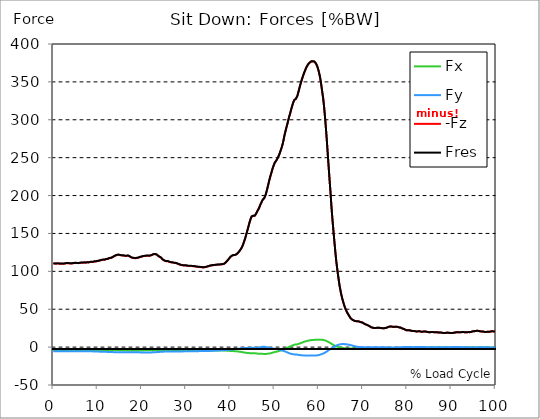
| Category |  Fx |  Fy |  -Fz |  Fres |
|---|---|---|---|---|
| 0.0 | -4.409 | -5.582 | 110.319 | 110.553 |
| 0.167348456675344 | -4.423 | -5.576 | 110.296 | 110.528 |
| 0.334696913350688 | -4.415 | -5.574 | 110.225 | 110.457 |
| 0.5020453700260321 | -4.398 | -5.568 | 110.176 | 110.407 |
| 0.669393826701376 | -4.362 | -5.558 | 110.17 | 110.399 |
| 0.83674228337672 | -4.415 | -5.533 | 110.345 | 110.575 |
| 1.0040907400520642 | -4.486 | -5.548 | 110.381 | 110.614 |
| 1.1621420602454444 | -4.445 | -5.577 | 110.21 | 110.445 |
| 1.3294905169207885 | -4.463 | -5.581 | 110.155 | 110.389 |
| 1.4968389735961325 | -4.468 | -5.563 | 110.136 | 110.371 |
| 1.6641874302714765 | -4.473 | -5.565 | 110.144 | 110.377 |
| 1.8315358869468206 | -4.472 | -5.595 | 110.119 | 110.355 |
| 1.9988843436221646 | -4.441 | -5.624 | 109.989 | 110.225 |
| 2.1662328002975086 | -4.432 | -5.603 | 109.993 | 110.227 |
| 2.333581256972853 | -4.429 | -5.576 | 110.012 | 110.244 |
| 2.5009297136481967 | -4.432 | -5.547 | 110.209 | 110.44 |
| 2.6682781703235405 | -4.436 | -5.517 | 110.408 | 110.638 |
| 2.8356266269988843 | -4.464 | -5.51 | 110.581 | 110.811 |
| 3.002975083674229 | -4.505 | -5.512 | 110.742 | 110.973 |
| 3.1703235403495724 | -4.496 | -5.51 | 110.774 | 111.005 |
| 3.337671997024917 | -4.466 | -5.509 | 110.682 | 110.912 |
| 3.4957233172182973 | -4.457 | -5.488 | 110.6 | 110.828 |
| 3.663071773893641 | -4.443 | -5.483 | 110.521 | 110.748 |
| 3.8304202305689854 | -4.419 | -5.471 | 110.455 | 110.681 |
| 3.997768687244329 | -4.394 | -5.447 | 110.412 | 110.635 |
| 4.165117143919673 | -4.387 | -5.435 | 110.426 | 110.65 |
| 4.332465600595017 | -4.399 | -5.437 | 110.521 | 110.744 |
| 4.499814057270361 | -4.42 | -5.443 | 110.646 | 110.871 |
| 4.667162513945706 | -4.458 | -5.456 | 110.851 | 111.077 |
| 4.834510970621049 | -4.496 | -5.468 | 111.057 | 111.285 |
| 5.001859427296393 | -4.506 | -5.488 | 111.13 | 111.36 |
| 5.169207883971737 | -4.491 | -5.516 | 111.037 | 111.267 |
| 5.336556340647081 | -4.434 | -5.528 | 110.856 | 111.085 |
| 5.503904797322425 | -4.377 | -5.528 | 110.746 | 110.973 |
| 5.671253253997769 | -4.375 | -5.534 | 110.823 | 111.05 |
| 5.82930457419115 | -4.366 | -5.529 | 110.921 | 111.147 |
| 5.996653030866494 | -4.362 | -5.52 | 111.045 | 111.27 |
| 6.164001487541838 | -4.389 | -5.486 | 111.296 | 111.521 |
| 6.331349944217181 | -4.445 | -5.484 | 111.518 | 111.744 |
| 6.498698400892526 | -4.462 | -5.534 | 111.516 | 111.744 |
| 6.66604685756787 | -4.43 | -5.564 | 111.404 | 111.633 |
| 6.833395314243213 | -4.457 | -5.553 | 111.517 | 111.747 |
| 7.000743770918558 | -4.5 | -5.57 | 111.624 | 111.856 |
| 7.168092227593902 | -4.447 | -5.618 | 111.518 | 111.751 |
| 7.335440684269246 | -4.377 | -5.635 | 111.446 | 111.677 |
| 7.50278914094459 | -4.383 | -5.603 | 111.668 | 111.897 |
| 7.6701375976199335 | -4.45 | -5.588 | 111.875 | 112.106 |
| 7.837486054295278 | -4.424 | -5.606 | 111.844 | 112.074 |
| 7.995537374488658 | -4.33 | -5.611 | 111.759 | 111.986 |
| 8.162885831164003 | -4.289 | -5.592 | 111.908 | 112.131 |
| 8.330234287839346 | -4.329 | -5.584 | 112.29 | 112.515 |
| 8.49758274451469 | -4.372 | -5.586 | 112.423 | 112.649 |
| 8.664931201190035 | -4.307 | -5.613 | 112.353 | 112.577 |
| 8.832279657865378 | -4.211 | -5.641 | 112.323 | 112.545 |
| 8.999628114540721 | -4.199 | -5.647 | 112.504 | 112.726 |
| 9.166976571216066 | -4.297 | -5.651 | 112.828 | 113.054 |
| 9.334325027891412 | -4.333 | -5.695 | 112.98 | 113.21 |
| 9.501673484566755 | -4.27 | -5.753 | 113.01 | 113.241 |
| 9.669021941242098 | -4.221 | -5.783 | 113.098 | 113.328 |
| 9.836370397917442 | -4.247 | -5.791 | 113.348 | 113.579 |
| 10.003718854592787 | -4.311 | -5.812 | 113.652 | 113.887 |
| 10.17106731126813 | -4.367 | -5.867 | 113.86 | 114.098 |
| 10.329118631461512 | -4.376 | -5.94 | 113.962 | 114.205 |
| 10.496467088136853 | -4.317 | -6.006 | 114.101 | 114.346 |
| 10.663815544812199 | -4.302 | -6.034 | 114.501 | 114.747 |
| 10.831164001487544 | -4.322 | -6.053 | 114.921 | 115.168 |
| 10.998512458162887 | -4.318 | -6.118 | 115.087 | 115.338 |
| 11.16586091483823 | -4.264 | -6.15 | 115.119 | 115.371 |
| 11.333209371513574 | -4.252 | -6.184 | 115.274 | 115.526 |
| 11.50055782818892 | -4.258 | -6.204 | 115.242 | 115.496 |
| 11.667906284864264 | -4.224 | -6.168 | 115.464 | 115.715 |
| 11.835254741539607 | -4.273 | -6.161 | 115.822 | 116.072 |
| 12.00260319821495 | -4.314 | -6.236 | 116.115 | 116.372 |
| 12.169951654890292 | -4.251 | -6.319 | 116.124 | 116.383 |
| 12.337300111565641 | -4.193 | -6.36 | 116.35 | 116.609 |
| 12.504648568240984 | -4.226 | -6.391 | 116.929 | 117.19 |
| 12.662699888434362 | -4.257 | -6.45 | 117.408 | 117.673 |
| 12.830048345109708 | -4.265 | -6.5 | 117.607 | 117.876 |
| 12.997396801785053 | -4.195 | -6.506 | 117.645 | 117.912 |
| 13.164745258460396 | -4.188 | -6.516 | 118.06 | 118.327 |
| 13.33209371513574 | -4.186 | -6.566 | 118.364 | 118.633 |
| 13.499442171811083 | -4.167 | -6.617 | 118.912 | 119.183 |
| 13.666790628486426 | -4.129 | -6.654 | 119.677 | 119.947 |
| 13.834139085161771 | -4.16 | -6.673 | 120.355 | 120.627 |
| 14.001487541837117 | -4.162 | -6.731 | 120.695 | 120.969 |
| 14.16883599851246 | -4.138 | -6.785 | 121.047 | 121.322 |
| 14.336184455187803 | -4.143 | -6.826 | 121.394 | 121.672 |
| 14.503532911863147 | -4.213 | -6.816 | 121.762 | 122.042 |
| 14.670881368538492 | -4.246 | -6.79 | 121.875 | 122.155 |
| 14.828932688731873 | -4.224 | -6.775 | 121.77 | 122.049 |
| 14.996281145407215 | -4.24 | -6.762 | 121.461 | 121.74 |
| 15.163629602082558 | -4.23 | -6.763 | 121.348 | 121.627 |
| 15.330978058757903 | -4.243 | -6.785 | 121.068 | 121.348 |
| 15.498326515433247 | -4.201 | -6.769 | 120.77 | 121.05 |
| 15.665674972108594 | -4.257 | -6.701 | 120.851 | 121.13 |
| 15.833023428783937 | -4.314 | -6.695 | 120.898 | 121.178 |
| 16.00037188545928 | -4.333 | -6.725 | 120.697 | 120.979 |
| 16.167720342134626 | -4.329 | -6.741 | 120.42 | 120.704 |
| 16.335068798809967 | -4.286 | -6.724 | 120.231 | 120.514 |
| 16.502417255485312 | -4.319 | -6.674 | 120.377 | 120.657 |
| 16.669765712160658 | -4.397 | -6.67 | 120.538 | 120.819 |
| 16.837114168836 | -4.443 | -6.676 | 120.514 | 120.799 |
| 17.004462625511344 | -4.501 | -6.67 | 120.466 | 120.753 |
| 17.16251394570472 | -4.528 | -6.731 | 120 | 120.291 |
| 17.32986240238007 | -4.494 | -6.796 | 119.334 | 119.628 |
| 17.497210859055414 | -4.459 | -6.86 | 118.665 | 118.962 |
| 17.664559315730756 | -4.441 | -6.9 | 118.193 | 118.49 |
| 17.8319077724061 | -4.541 | -6.899 | 117.795 | 118.097 |
| 17.999256229081443 | -4.596 | -6.905 | 117.504 | 117.81 |
| 18.166604685756788 | -4.6 | -6.915 | 117.55 | 117.857 |
| 18.333953142432133 | -4.613 | -6.912 | 117.439 | 117.747 |
| 18.501301599107478 | -4.591 | -6.88 | 117.369 | 117.673 |
| 18.668650055782823 | -4.585 | -6.861 | 117.366 | 117.671 |
| 18.835998512458165 | -4.579 | -6.851 | 117.486 | 117.789 |
| 19.00334696913351 | -4.536 | -6.857 | 117.703 | 118.004 |
| 19.170695425808855 | -4.478 | -6.899 | 117.914 | 118.215 |
| 19.338043882484197 | -4.429 | -6.936 | 118.155 | 118.455 |
| 19.496095202677576 | -4.441 | -6.941 | 118.633 | 118.932 |
| 19.66344365935292 | -4.472 | -6.959 | 118.991 | 119.292 |
| 19.830792116028263 | -4.413 | -7.007 | 119.17 | 119.471 |
| 19.998140572703612 | -4.339 | -6.989 | 119.371 | 119.666 |
| 20.165489029378953 | -4.334 | -6.958 | 119.743 | 120.036 |
| 20.3328374860543 | -4.328 | -6.948 | 120.06 | 120.353 |
| 20.500185942729644 | -4.286 | -6.955 | 120.269 | 120.56 |
| 20.667534399404985 | -4.241 | -7.002 | 120.152 | 120.445 |
| 20.83488285608033 | -4.198 | -7.025 | 120.19 | 120.48 |
| 21.002231312755672 | -4.214 | -7.009 | 120.5 | 120.79 |
| 21.16957976943102 | -4.244 | -7.014 | 120.631 | 120.923 |
| 21.336928226106362 | -4.23 | -7.063 | 120.491 | 120.785 |
| 21.504276682781704 | -4.186 | -7.085 | 120.29 | 120.584 |
| 21.67162513945705 | -4.177 | -7.049 | 120.407 | 120.698 |
| 21.82967645965043 | -4.235 | -7.007 | 120.705 | 120.995 |
| 21.997024916325774 | -4.249 | -7.017 | 120.873 | 121.162 |
| 22.16437337300112 | -4.313 | -6.994 | 121.14 | 121.43 |
| 22.33172182967646 | -4.349 | -6.956 | 121.634 | 121.923 |
| 22.499070286351806 | -4.349 | -6.92 | 122.199 | 122.485 |
| 22.666418743027148 | -4.306 | -6.859 | 122.545 | 122.827 |
| 22.833767199702496 | -4.284 | -6.846 | 122.634 | 122.914 |
| 23.00111565637784 | -4.305 | -6.74 | 122.673 | 122.95 |
| 23.168464113053183 | -4.307 | -6.652 | 122.576 | 122.85 |
| 23.335812569728528 | -4.287 | -6.597 | 122.123 | 122.396 |
| 23.50316102640387 | -4.271 | -6.531 | 121.52 | 121.791 |
| 23.670509483079215 | -4.238 | -6.432 | 120.453 | 120.72 |
| 23.83785793975456 | -4.181 | -6.383 | 119.694 | 119.957 |
| 23.995909259947936 | -4.231 | -6.305 | 119.096 | 119.359 |
| 24.163257716623285 | -4.313 | -6.27 | 118.725 | 118.99 |
| 24.330606173298627 | -4.323 | -6.224 | 118.07 | 118.337 |
| 24.49795462997397 | -4.294 | -6.144 | 116.918 | 117.182 |
| 24.665303086649313 | -4.274 | -6.058 | 115.775 | 116.037 |
| 24.83265154332466 | -4.29 | -5.988 | 115.074 | 115.333 |
| 25.0 | -4.342 | -5.955 | 114.58 | 114.839 |
| 25.167348456675345 | -4.371 | -5.941 | 113.937 | 114.198 |
| 25.334696913350694 | -4.378 | -5.952 | 113.501 | 113.763 |
| 25.502045370026035 | -4.414 | -5.925 | 113.385 | 113.646 |
| 25.669393826701377 | -4.429 | -5.934 | 113.394 | 113.657 |
| 25.836742283376722 | -4.459 | -5.931 | 113.319 | 113.585 |
| 26.004090740052067 | -4.458 | -5.926 | 113.068 | 113.332 |
| 26.17143919672741 | -4.443 | -5.936 | 112.609 | 112.873 |
| 26.329490516920792 | -4.432 | -5.932 | 112.194 | 112.459 |
| 26.49683897359613 | -4.425 | -5.883 | 111.991 | 112.254 |
| 26.66418743027148 | -4.437 | -5.851 | 111.86 | 112.122 |
| 26.831535886946828 | -4.453 | -5.83 | 111.738 | 111.999 |
| 26.998884343622166 | -4.475 | -5.786 | 111.576 | 111.837 |
| 27.166232800297514 | -4.486 | -5.771 | 111.33 | 111.591 |
| 27.333581256972852 | -4.478 | -5.783 | 111.14 | 111.402 |
| 27.5009297136482 | -4.502 | -5.8 | 111.042 | 111.306 |
| 27.668278170323543 | -4.522 | -5.81 | 110.909 | 111.173 |
| 27.835626626998888 | -4.516 | -5.802 | 110.657 | 110.921 |
| 28.002975083674233 | -4.511 | -5.789 | 110.33 | 110.593 |
| 28.170323540349575 | -4.507 | -5.768 | 109.925 | 110.188 |
| 28.33767199702492 | -4.467 | -5.749 | 109.389 | 109.65 |
| 28.50502045370026 | -4.462 | -5.705 | 109.012 | 109.27 |
| 28.663071773893645 | -4.496 | -5.665 | 108.749 | 109.007 |
| 28.830420230568986 | -4.506 | -5.662 | 108.455 | 108.713 |
| 28.99776868724433 | -4.499 | -5.657 | 108.194 | 108.452 |
| 29.165117143919673 | -4.478 | -5.649 | 107.959 | 108.217 |
| 29.33246560059502 | -4.475 | -5.64 | 107.864 | 108.12 |
| 29.499814057270367 | -4.482 | -5.625 | 107.823 | 108.08 |
| 29.66716251394571 | -4.494 | -5.598 | 107.795 | 108.05 |
| 29.834510970621054 | -4.51 | -5.588 | 107.743 | 108 |
| 30.00185942729639 | -4.525 | -5.582 | 107.687 | 107.943 |
| 30.169207883971744 | -4.529 | -5.59 | 107.474 | 107.733 |
| 30.33655634064708 | -4.532 | -5.592 | 107.283 | 107.542 |
| 30.50390479732243 | -4.534 | -5.585 | 107.166 | 107.425 |
| 30.671253253997772 | -4.544 | -5.574 | 107.112 | 107.37 |
| 30.829304574191156 | -4.566 | -5.554 | 107.143 | 107.4 |
| 30.996653030866494 | -4.587 | -5.536 | 107.174 | 107.431 |
| 31.164001487541842 | -4.614 | -5.515 | 107.041 | 107.297 |
| 31.331349944217187 | -4.639 | -5.495 | 106.903 | 107.161 |
| 31.498698400892525 | -4.643 | -5.498 | 106.846 | 107.104 |
| 31.666046857567874 | -4.646 | -5.5 | 106.79 | 107.048 |
| 31.833395314243212 | -4.646 | -5.499 | 106.705 | 106.963 |
| 32.00074377091856 | -4.636 | -5.48 | 106.521 | 106.778 |
| 32.1680922275939 | -4.627 | -5.462 | 106.337 | 106.592 |
| 32.33544068426925 | -4.619 | -5.432 | 106.14 | 106.394 |
| 32.50278914094459 | -4.619 | -5.387 | 105.928 | 106.178 |
| 32.670137597619934 | -4.654 | -5.35 | 105.894 | 106.145 |
| 32.83748605429528 | -4.688 | -5.314 | 105.861 | 106.113 |
| 33.004834510970625 | -4.719 | -5.283 | 105.81 | 106.061 |
| 33.162885831164004 | -4.733 | -5.28 | 105.657 | 105.91 |
| 33.33023428783935 | -4.747 | -5.276 | 105.506 | 105.758 |
| 33.497582744514695 | -4.76 | -5.274 | 105.354 | 105.607 |
| 33.664931201190036 | -4.753 | -5.267 | 105.276 | 105.528 |
| 33.83227965786538 | -4.732 | -5.258 | 105.238 | 105.489 |
| 33.99962811454073 | -4.713 | -5.249 | 105.2 | 105.45 |
| 34.16697657121607 | -4.693 | -5.232 | 105.267 | 105.512 |
| 34.33432502789141 | -4.673 | -5.204 | 105.52 | 105.763 |
| 34.50167348456676 | -4.652 | -5.174 | 105.773 | 106.012 |
| 34.6690219412421 | -4.67 | -5.128 | 106.018 | 106.256 |
| 34.83637039791744 | -4.704 | -5.072 | 106.26 | 106.495 |
| 35.00371885459279 | -4.725 | -5.026 | 106.558 | 106.79 |
| 35.17106731126814 | -4.727 | -4.989 | 106.935 | 107.163 |
| 35.338415767943474 | -4.724 | -4.948 | 107.246 | 107.471 |
| 35.49646708813686 | -4.713 | -4.907 | 107.507 | 107.729 |
| 35.6638155448122 | -4.682 | -4.867 | 107.735 | 107.952 |
| 35.831164001487544 | -4.625 | -4.818 | 107.849 | 108.061 |
| 35.998512458162885 | -4.569 | -4.769 | 107.966 | 108.172 |
| 36.165860914838234 | -4.515 | -4.726 | 108.124 | 108.327 |
| 36.333209371513576 | -4.479 | -4.687 | 108.247 | 108.446 |
| 36.50055782818892 | -4.458 | -4.65 | 108.349 | 108.545 |
| 36.667906284864266 | -4.435 | -4.611 | 108.516 | 108.709 |
| 36.83525474153961 | -4.4 | -4.576 | 108.591 | 108.781 |
| 37.002603198214956 | -4.4 | -4.515 | 108.711 | 108.898 |
| 37.1699516548903 | -4.403 | -4.451 | 108.835 | 109.018 |
| 37.337300111565646 | -4.404 | -4.398 | 108.9 | 109.081 |
| 37.50464856824098 | -4.407 | -4.348 | 108.952 | 109.13 |
| 37.66269988843437 | -4.381 | -4.291 | 109.005 | 109.179 |
| 37.83004834510971 | -4.35 | -4.232 | 109.043 | 109.215 |
| 37.99739680178505 | -4.342 | -4.167 | 109.176 | 109.344 |
| 38.16474525846039 | -4.349 | -4.103 | 109.392 | 109.558 |
| 38.33209371513574 | -4.346 | -4.095 | 109.505 | 109.67 |
| 38.49944217181109 | -4.345 | -4.093 | 109.628 | 109.792 |
| 38.666790628486424 | -4.398 | -4.064 | 110.124 | 110.29 |
| 38.83413908516178 | -4.469 | -4.027 | 110.822 | 110.988 |
| 39.001487541837115 | -4.571 | -3.947 | 111.806 | 111.973 |
| 39.16883599851246 | -4.678 | -3.835 | 112.814 | 112.982 |
| 39.336184455187805 | -4.748 | -3.762 | 113.966 | 114.133 |
| 39.503532911863154 | -4.819 | -3.673 | 115.104 | 115.269 |
| 39.670881368538495 | -4.9 | -3.561 | 116.268 | 116.432 |
| 39.83822982521384 | -4.969 | -3.518 | 117.51 | 117.674 |
| 39.996281145407224 | -5.014 | -3.415 | 118.807 | 118.969 |
| 40.163629602082565 | -5.085 | -3.294 | 119.778 | 119.939 |
| 40.33097805875791 | -5.157 | -3.182 | 120.443 | 120.602 |
| 40.498326515433256 | -5.2 | -3.075 | 120.969 | 121.127 |
| 40.6656749721086 | -5.229 | -2.966 | 121.317 | 121.473 |
| 40.83302342878393 | -5.254 | -2.859 | 121.256 | 121.409 |
| 41.00037188545929 | -5.344 | -2.752 | 121.41 | 121.565 |
| 41.16772034213463 | -5.441 | -2.614 | 121.838 | 121.995 |
| 41.33506879880997 | -5.474 | -2.56 | 122.219 | 122.377 |
| 41.50241725548531 | -5.57 | -2.452 | 122.942 | 123.103 |
| 41.66976571216066 | -5.692 | -2.339 | 123.813 | 123.978 |
| 41.837114168836 | -5.86 | -2.194 | 124.898 | 125.068 |
| 42.004462625511344 | -6.01 | -2.07 | 126.027 | 126.201 |
| 42.17181108218669 | -6.131 | -1.956 | 127.242 | 127.418 |
| 42.32986240238007 | -6.247 | -1.795 | 128.803 | 128.98 |
| 42.497210859055414 | -6.361 | -1.617 | 130.308 | 130.485 |
| 42.66455931573076 | -6.509 | -1.474 | 132.119 | 132.299 |
| 42.831907772406105 | -6.722 | -1.357 | 134.357 | 134.544 |
| 42.999256229081446 | -6.953 | -1.271 | 137.043 | 137.237 |
| 43.16660468575679 | -7.15 | -1.192 | 139.918 | 140.117 |
| 43.33395314243214 | -7.296 | -1.118 | 142.686 | 142.888 |
| 43.50130159910748 | -7.457 | -1.091 | 146.087 | 146.294 |
| 43.66865005578282 | -7.606 | -1.101 | 149.627 | 149.837 |
| 43.83599851245817 | -7.693 | -1.044 | 153.194 | 153.402 |
| 44.00334696913351 | -7.797 | -1.015 | 156.463 | 156.673 |
| 44.17069542580886 | -7.902 | -1.025 | 160.265 | 160.475 |
| 44.3380438824842 | -7.967 | -1.031 | 164.01 | 164.217 |
| 44.49609520267758 | -7.983 | -1.015 | 167.104 | 167.308 |
| 44.66344365935292 | -7.947 | -0.962 | 170.145 | 170.344 |
| 44.83079211602827 | -7.942 | -0.943 | 172.253 | 172.45 |
| 44.99814057270361 | -8.012 | -0.94 | 173.281 | 173.479 |
| 45.16548902937895 | -8.027 | -0.899 | 173.204 | 173.402 |
| 45.332837486054295 | -8.08 | -0.829 | 172.897 | 173.096 |
| 45.500185942729644 | -8.144 | -0.816 | 173.221 | 173.421 |
| 45.66753439940499 | -8.213 | -0.821 | 173.98 | 174.183 |
| 45.83488285608033 | -8.26 | -0.828 | 175.821 | 176.025 |
| 46.00223131275568 | -8.423 | -0.896 | 177.844 | 178.053 |
| 46.16957976943102 | -8.545 | -0.839 | 179.904 | 180.118 |
| 46.336928226106366 | -8.682 | -0.703 | 181.342 | 181.56 |
| 46.50427668278171 | -8.789 | -0.499 | 183.237 | 183.462 |
| 46.671625139457056 | -8.833 | -0.291 | 185.904 | 186.131 |
| 46.829676459650436 | -8.857 | -0.066 | 188.222 | 188.456 |
| 46.99702491632577 | -8.892 | 0.176 | 190.219 | 190.458 |
| 47.16437337300112 | -8.899 | 0.38 | 192.337 | 192.58 |
| 47.33172182967646 | -8.905 | 0.462 | 194.251 | 194.495 |
| 47.49907028635181 | -8.936 | 0.495 | 195.29 | 195.534 |
| 47.66641874302716 | -8.98 | 0.499 | 196.367 | 196.609 |
| 47.83376719970249 | -9.026 | 0.357 | 198.523 | 198.763 |
| 48.001115656377834 | -9.049 | 0.161 | 200.969 | 201.203 |
| 48.16846411305319 | -9.028 | -0.06 | 204.326 | 204.554 |
| 48.33581256972853 | -8.888 | -0.226 | 208.156 | 208.373 |
| 48.50316102640387 | -8.713 | -0.382 | 212.049 | 212.253 |
| 48.67050948307921 | -8.512 | -0.561 | 216.177 | 216.371 |
| 48.837857939754564 | -8.386 | -0.778 | 220.294 | 220.483 |
| 49.005206396429905 | -8.256 | -1.097 | 224.049 | 224.23 |
| 49.163257716623285 | -8.054 | -1.389 | 227.434 | 227.602 |
| 49.33060617329863 | -7.81 | -1.658 | 230.62 | 230.775 |
| 49.49795462997397 | -7.496 | -1.827 | 234.344 | 234.489 |
| 49.66530308664932 | -7.122 | -1.926 | 237.342 | 237.475 |
| 49.832651543324666 | -6.8 | -2.004 | 239.974 | 240.098 |
| 50.0 | -6.532 | -2.08 | 242.545 | 242.663 |
| 50.16734845667534 | -6.34 | -2.124 | 244.231 | 244.344 |
| 50.33469691335069 | -6.167 | -2.163 | 245.57 | 245.678 |
| 50.50204537002604 | -5.979 | -2.284 | 247.123 | 247.225 |
| 50.66939382670139 | -5.741 | -2.448 | 248.892 | 248.988 |
| 50.836742283376715 | -5.448 | -2.66 | 250.896 | 250.983 |
| 51.00409074005207 | -5.177 | -2.889 | 253.047 | 253.129 |
| 51.17143919672741 | -4.916 | -3.158 | 255.541 | 255.619 |
| 51.32949051692079 | -4.633 | -3.475 | 258.436 | 258.511 |
| 51.496838973596134 | -4.268 | -3.902 | 261.204 | 261.276 |
| 51.66418743027148 | -3.921 | -4.279 | 264.199 | 264.269 |
| 51.831535886946824 | -3.606 | -4.579 | 267.709 | 267.778 |
| 51.99888434362217 | -3.287 | -4.905 | 272.017 | 272.086 |
| 52.16623280029752 | -2.869 | -5.258 | 276.717 | 276.787 |
| 52.33358125697285 | -2.376 | -5.609 | 281.407 | 281.48 |
| 52.5009297136482 | -1.912 | -5.982 | 285.351 | 285.426 |
| 52.668278170323546 | -1.448 | -6.366 | 289.081 | 289.16 |
| 52.835626626998895 | -1.006 | -6.773 | 292.813 | 292.898 |
| 53.00297508367424 | -0.613 | -7.215 | 296.622 | 296.714 |
| 53.17032354034958 | -0.199 | -7.658 | 300.5 | 300.603 |
| 53.33767199702492 | 0.263 | -8.05 | 304.333 | 304.445 |
| 53.50502045370027 | 0.688 | -8.428 | 307.566 | 307.688 |
| 53.663071773893655 | 1.131 | -8.753 | 311.134 | 311.265 |
| 53.83042023056899 | 1.576 | -8.988 | 314.819 | 314.958 |
| 53.99776868724433 | 2.022 | -9.183 | 318.297 | 318.443 |
| 54.16511714391967 | 2.452 | -9.354 | 321.45 | 321.601 |
| 54.33246560059503 | 2.862 | -9.518 | 324.22 | 324.378 |
| 54.49981405727037 | 3.229 | -9.604 | 326.155 | 326.317 |
| 54.667162513945705 | 3.499 | -9.683 | 326.972 | 327.139 |
| 54.834510970621054 | 3.516 | -9.768 | 327.507 | 327.677 |
| 55.0018594272964 | 3.557 | -9.865 | 328.405 | 328.577 |
| 55.169207883971744 | 3.731 | -10.026 | 331.29 | 331.468 |
| 55.336556340647086 | 4.042 | -10.149 | 334.974 | 335.157 |
| 55.50390479732243 | 4.373 | -10.371 | 338.534 | 338.726 |
| 55.671253253997776 | 4.747 | -10.511 | 342.359 | 342.558 |
| 55.83860171067312 | 5.069 | -10.601 | 346.079 | 346.283 |
| 55.9966530308665 | 5.412 | -10.698 | 349.295 | 349.505 |
| 56.16400148754184 | 5.816 | -10.805 | 352.771 | 352.989 |
| 56.33134994421718 | 6.203 | -10.894 | 355.679 | 355.904 |
| 56.498698400892536 | 6.617 | -10.95 | 358.612 | 358.844 |
| 56.66604685756788 | 6.959 | -11.007 | 361.264 | 361.501 |
| 56.83339531424321 | 7.263 | -11.011 | 363.708 | 363.95 |
| 57.00074377091856 | 7.584 | -11.014 | 366.201 | 366.448 |
| 57.16809222759391 | 7.882 | -11.066 | 368.474 | 368.727 |
| 57.33544068426925 | 8.123 | -11.136 | 370.322 | 370.581 |
| 57.5027891409446 | 8.364 | -11.201 | 372.131 | 372.397 |
| 57.670137597619934 | 8.587 | -11.257 | 373.627 | 373.898 |
| 57.83748605429528 | 8.785 | -11.273 | 374.791 | 375.066 |
| 58.004834510970625 | 8.961 | -11.178 | 375.566 | 375.843 |
| 58.16288583116401 | 9.102 | -11.113 | 376.41 | 376.687 |
| 58.330234287839346 | 9.253 | -11.08 | 376.99 | 377.269 |
| 58.497582744514695 | 9.434 | -11.107 | 377.117 | 377.402 |
| 58.66493120119004 | 9.461 | -11.108 | 377.021 | 377.306 |
| 58.832279657865385 | 9.509 | -11.117 | 376.869 | 377.156 |
| 58.999628114540734 | 9.571 | -11.122 | 376.686 | 376.975 |
| 59.16697657121607 | 9.628 | -11.111 | 375.794 | 376.085 |
| 59.33432502789142 | 9.705 | -11.088 | 374.408 | 374.701 |
| 59.50167348456676 | 9.754 | -11.012 | 372.579 | 372.872 |
| 59.66902194124211 | 9.806 | -10.873 | 370.252 | 370.544 |
| 59.83637039791745 | 9.853 | -10.694 | 367.346 | 367.638 |
| 60.00371885459278 | 9.88 | -10.467 | 363.779 | 364.066 |
| 60.17106731126813 | 9.843 | -10.184 | 359.623 | 359.904 |
| 60.33841576794349 | 9.84 | -9.921 | 354.859 | 355.136 |
| 60.49646708813685 | 9.807 | -9.596 | 348.886 | 349.158 |
| 60.6638155448122 | 9.715 | -9.252 | 342.145 | 342.412 |
| 60.831164001487544 | 9.611 | -8.913 | 335.038 | 335.297 |
| 60.99851245816289 | 9.457 | -8.579 | 328.459 | 328.711 |
| 61.16586091483824 | 9.26 | -8.108 | 319.477 | 319.717 |
| 61.333209371513576 | 9.02 | -7.574 | 309.205 | 309.434 |
| 61.50055782818892 | 8.73 | -7.033 | 297.984 | 298.2 |
| 61.667906284864266 | 8.333 | -6.446 | 285.606 | 285.806 |
| 61.835254741539615 | 7.867 | -5.802 | 272.511 | 272.693 |
| 62.002603198214956 | 7.376 | -5.093 | 258.311 | 258.473 |
| 62.16995165489029 | 6.871 | -4.399 | 244.318 | 244.462 |
| 62.33730011156564 | 6.33 | -3.732 | 230.451 | 230.576 |
| 62.504648568240995 | 5.779 | -3.097 | 216.821 | 216.926 |
| 62.67199702491633 | 5.247 | -2.532 | 204.029 | 204.122 |
| 62.83004834510971 | 4.548 | -1.828 | 188.876 | 188.95 |
| 62.99739680178505 | 3.928 | -1.189 | 175.824 | 175.885 |
| 63.1647452584604 | 3.373 | -0.586 | 163.957 | 164.005 |
| 63.33209371513575 | 2.866 | -0.049 | 153.063 | 153.103 |
| 63.4994421718111 | 2.38 | 0.541 | 141.935 | 141.969 |
| 63.666790628486424 | 1.889 | 1.076 | 131.434 | 131.466 |
| 63.83413908516177 | 1.366 | 1.597 | 120.968 | 121.002 |
| 64.00148754183712 | 0.996 | 2.154 | 111.818 | 111.857 |
| 64.16883599851248 | 0.663 | 2.542 | 103.905 | 103.951 |
| 64.3361844551878 | 0.316 | 2.861 | 96.372 | 96.428 |
| 64.50353291186315 | 0.036 | 3.173 | 89.665 | 89.733 |
| 64.6708813685385 | -0.238 | 3.496 | 82.72 | 82.808 |
| 64.83822982521384 | -0.489 | 3.698 | 77.283 | 77.386 |
| 65.00557828188919 | -0.714 | 3.855 | 72.049 | 72.171 |
| 65.16362960208257 | -0.908 | 3.929 | 67.783 | 67.915 |
| 65.3309780587579 | -1.085 | 3.986 | 63.697 | 63.843 |
| 65.49832651543326 | -1.235 | 4.006 | 60.168 | 60.326 |
| 65.6656749721086 | -1.359 | 3.986 | 56.932 | 57.1 |
| 65.83302342878395 | -1.495 | 3.945 | 53.781 | 53.961 |
| 66.00037188545929 | -1.622 | 3.869 | 51.079 | 51.267 |
| 66.16772034213463 | -1.746 | 3.785 | 48.69 | 48.887 |
| 66.33506879880998 | -1.859 | 3.665 | 46.631 | 46.832 |
| 66.50241725548531 | -1.914 | 3.511 | 44.872 | 45.07 |
| 66.66976571216065 | -1.953 | 3.33 | 43.213 | 43.405 |
| 66.83711416883601 | -1.989 | 3.144 | 41.641 | 41.83 |
| 67.00446262551135 | -2.001 | 2.956 | 39.971 | 40.156 |
| 67.1718110821867 | -1.937 | 2.692 | 38.377 | 38.545 |
| 67.32986240238007 | -1.914 | 2.436 | 37.313 | 37.468 |
| 67.49721085905541 | -1.899 | 2.156 | 36.495 | 36.633 |
| 67.66455931573076 | -1.926 | 1.921 | 35.912 | 36.038 |
| 67.83190777240611 | -1.887 | 1.703 | 35.403 | 35.518 |
| 67.99925622908145 | -1.813 | 1.394 | 34.814 | 34.913 |
| 68.16660468575678 | -1.799 | 1.103 | 34.429 | 34.52 |
| 68.33395314243214 | -1.812 | 0.834 | 34.2 | 34.284 |
| 68.50130159910749 | -1.811 | 0.633 | 34.135 | 34.215 |
| 68.66865005578282 | -1.827 | 0.451 | 34.183 | 34.262 |
| 68.83599851245816 | -1.829 | 0.308 | 34.206 | 34.285 |
| 69.00334696913352 | -1.787 | 0.192 | 33.967 | 34.044 |
| 69.17069542580886 | -1.756 | 0.104 | 33.604 | 33.682 |
| 69.3380438824842 | -1.7 | 0.022 | 33.204 | 33.283 |
| 69.50539233915956 | -1.655 | -0.076 | 32.909 | 32.988 |
| 69.66344365935292 | -1.666 | -0.125 | 32.785 | 32.864 |
| 69.83079211602826 | -1.665 | -0.147 | 32.506 | 32.586 |
| 69.99814057270362 | -1.63 | -0.144 | 31.923 | 32.002 |
| 70.16548902937896 | -1.598 | -0.109 | 31.354 | 31.434 |
| 70.33283748605429 | -1.538 | -0.173 | 30.624 | 30.701 |
| 70.50018594272964 | -1.522 | -0.217 | 30.145 | 30.219 |
| 70.667534399405 | -1.533 | -0.214 | 29.866 | 29.941 |
| 70.83488285608033 | -1.56 | -0.177 | 29.488 | 29.564 |
| 71.00223131275568 | -1.536 | -0.192 | 28.833 | 28.908 |
| 71.16957976943102 | -1.539 | -0.274 | 28.525 | 28.598 |
| 71.33692822610637 | -1.566 | -0.22 | 28.222 | 28.297 |
| 71.50427668278171 | -1.49 | -0.187 | 27.536 | 27.607 |
| 71.67162513945706 | -1.425 | -0.15 | 26.794 | 26.86 |
| 71.8389735961324 | -1.408 | -0.12 | 26.248 | 26.312 |
| 71.99702491632577 | -1.436 | -0.133 | 25.914 | 25.979 |
| 72.16437337300113 | -1.461 | -0.157 | 25.634 | 25.7 |
| 72.33172182967647 | -1.432 | -0.187 | 25.339 | 25.403 |
| 72.49907028635181 | -1.413 | -0.192 | 25.241 | 25.303 |
| 72.66641874302715 | -1.396 | -0.161 | 25.22 | 25.281 |
| 72.8337671997025 | -1.378 | -0.15 | 25.199 | 25.26 |
| 73.00111565637783 | -1.393 | -0.161 | 25.274 | 25.338 |
| 73.16846411305319 | -1.41 | -0.178 | 25.43 | 25.494 |
| 73.33581256972853 | -1.403 | -0.177 | 25.547 | 25.611 |
| 73.50316102640387 | -1.382 | -0.167 | 25.579 | 25.643 |
| 73.67050948307921 | -1.345 | -0.182 | 25.539 | 25.598 |
| 73.83785793975457 | -1.339 | -0.179 | 25.324 | 25.38 |
| 74.00520639642991 | -1.313 | -0.152 | 25.109 | 25.16 |
| 74.16325771662328 | -1.344 | -0.097 | 25.076 | 25.127 |
| 74.33060617329863 | -1.36 | -0.075 | 24.956 | 25.006 |
| 74.49795462997398 | -1.371 | -0.063 | 24.811 | 24.861 |
| 74.66530308664932 | -1.328 | -0.096 | 24.833 | 24.881 |
| 74.83265154332466 | -1.308 | -0.097 | 24.945 | 24.993 |
| 75.00000000000001 | -1.311 | -0.086 | 25.041 | 25.087 |
| 75.16734845667534 | -1.308 | -0.152 | 25.235 | 25.281 |
| 75.3346969133507 | -1.321 | -0.244 | 25.553 | 25.598 |
| 75.50204537002605 | -1.367 | -0.264 | 25.962 | 26.009 |
| 75.66939382670138 | -1.35 | -0.328 | 26.4 | 26.446 |
| 75.83674228337672 | -1.375 | -0.342 | 26.774 | 26.821 |
| 76.00409074005208 | -1.373 | -0.369 | 27.01 | 27.055 |
| 76.17143919672742 | -1.356 | -0.391 | 27.22 | 27.267 |
| 76.33878765340276 | -1.332 | -0.404 | 27.246 | 27.291 |
| 76.49683897359614 | -1.307 | -0.426 | 27.038 | 27.081 |
| 76.66418743027148 | -1.237 | -0.48 | 26.784 | 26.824 |
| 76.83153588694682 | -1.172 | -0.517 | 26.657 | 26.695 |
| 76.99888434362218 | -1.193 | -0.459 | 26.765 | 26.805 |
| 77.16623280029752 | -1.167 | -0.436 | 26.715 | 26.753 |
| 77.33358125697285 | -1.122 | -0.462 | 26.624 | 26.662 |
| 77.5009297136482 | -1.129 | -0.421 | 26.846 | 26.883 |
| 77.66827817032356 | -1.131 | -0.364 | 26.886 | 26.921 |
| 77.83562662699889 | -1.098 | -0.373 | 26.698 | 26.733 |
| 78.00297508367423 | -1.047 | -0.385 | 26.396 | 26.43 |
| 78.17032354034959 | -0.988 | -0.371 | 26.018 | 26.05 |
| 78.33767199702493 | -1.063 | -0.269 | 26.016 | 26.05 |
| 78.50502045370027 | -1.072 | -0.199 | 25.756 | 25.79 |
| 78.67236891037561 | -1.041 | -0.17 | 25.22 | 25.254 |
| 78.83042023056899 | -1.007 | -0.146 | 24.743 | 24.776 |
| 78.99776868724433 | -1.023 | -0.077 | 24.528 | 24.563 |
| 79.16511714391969 | -0.995 | -0.016 | 24.149 | 24.183 |
| 79.33246560059503 | -0.996 | 0.011 | 23.65 | 23.684 |
| 79.49981405727036 | -0.972 | 0.044 | 23.15 | 23.186 |
| 79.66716251394571 | -0.961 | 0.097 | 22.58 | 22.617 |
| 79.83451097062107 | -0.932 | 0.072 | 22.195 | 22.232 |
| 80.00185942729641 | -0.956 | 0.098 | 22.143 | 22.181 |
| 80.16920788397174 | -0.974 | 0.12 | 22.109 | 22.146 |
| 80.33655634064709 | -1.032 | 0.102 | 22.244 | 22.284 |
| 80.50390479732243 | -1.033 | 0.08 | 22.307 | 22.346 |
| 80.67125325399778 | -1.002 | 0.102 | 22.064 | 22.104 |
| 80.83860171067312 | -0.943 | 0.069 | 21.649 | 21.688 |
| 80.99665303086651 | -0.918 | 0.005 | 21.419 | 21.457 |
| 81.16400148754184 | -0.905 | -0.004 | 21.319 | 21.357 |
| 81.3313499442172 | -0.889 | -0.048 | 21.209 | 21.248 |
| 81.49869840089255 | -0.909 | -0.032 | 21.34 | 21.382 |
| 81.66604685756786 | -0.886 | -0.005 | 21.187 | 21.229 |
| 81.83339531424322 | -0.864 | 0.033 | 20.908 | 20.947 |
| 82.00074377091858 | -0.81 | 0.016 | 20.609 | 20.65 |
| 82.16809222759392 | -0.787 | -0.006 | 20.568 | 20.606 |
| 82.33544068426926 | -0.824 | -0.005 | 20.703 | 20.743 |
| 82.50278914094459 | -0.856 | 0.015 | 20.857 | 20.9 |
| 82.67013759761994 | -0.878 | 0.047 | 20.988 | 21.031 |
| 82.83748605429528 | -0.839 | 0.074 | 20.807 | 20.849 |
| 83.00483451097062 | -0.774 | 0.037 | 20.528 | 20.568 |
| 83.17218296764597 | -0.746 | 0.038 | 20.375 | 20.412 |
| 83.33023428783935 | -0.758 | 0.05 | 20.4 | 20.437 |
| 83.4975827445147 | -0.724 | 0.009 | 20.328 | 20.361 |
| 83.66493120119004 | -0.762 | 0.034 | 20.561 | 20.596 |
| 83.83227965786537 | -0.786 | 0.043 | 20.679 | 20.715 |
| 83.99962811454073 | -0.785 | 0.017 | 20.693 | 20.727 |
| 84.16697657121607 | -0.743 | -0.021 | 20.534 | 20.568 |
| 84.33432502789142 | -0.699 | -0.05 | 20.329 | 20.361 |
| 84.50167348456677 | -0.661 | -0.097 | 20.1 | 20.131 |
| 84.6690219412421 | -0.628 | -0.151 | 19.866 | 19.898 |
| 84.83637039791745 | -0.612 | -0.19 | 19.726 | 19.759 |
| 85.0037188545928 | -0.617 | -0.21 | 19.684 | 19.719 |
| 85.17106731126813 | -0.625 | -0.227 | 19.631 | 19.666 |
| 85.33841576794349 | -0.629 | -0.226 | 19.651 | 19.686 |
| 85.50576422461883 | -0.654 | -0.216 | 19.844 | 19.878 |
| 85.66381554481221 | -0.672 | -0.209 | 19.883 | 19.919 |
| 85.83116400148755 | -0.694 | -0.198 | 19.866 | 19.902 |
| 85.99851245816289 | -0.66 | -0.222 | 19.69 | 19.725 |
| 86.16586091483823 | -0.618 | -0.253 | 19.529 | 19.565 |
| 86.33320937151358 | -0.582 | -0.276 | 19.457 | 19.493 |
| 86.50055782818893 | -0.606 | -0.257 | 19.571 | 19.608 |
| 86.66790628486427 | -0.623 | -0.23 | 19.682 | 19.719 |
| 86.83525474153961 | -0.607 | -0.193 | 19.59 | 19.627 |
| 87.00260319821496 | -0.572 | -0.192 | 19.391 | 19.428 |
| 87.16995165489031 | -0.534 | -0.254 | 19.113 | 19.151 |
| 87.33730011156564 | -0.559 | -0.268 | 19.104 | 19.144 |
| 87.504648568241 | -0.534 | -0.248 | 19.184 | 19.222 |
| 87.67199702491634 | -0.498 | -0.231 | 19.161 | 19.197 |
| 87.83004834510972 | -0.459 | -0.217 | 19.045 | 19.082 |
| 87.99739680178506 | -0.418 | -0.226 | 18.769 | 18.805 |
| 88.1647452584604 | -0.389 | -0.233 | 18.634 | 18.671 |
| 88.33209371513574 | -0.378 | -0.224 | 18.59 | 18.627 |
| 88.49944217181108 | -0.367 | -0.205 | 18.595 | 18.63 |
| 88.66679062848644 | -0.355 | -0.199 | 18.668 | 18.704 |
| 88.83413908516178 | -0.381 | -0.177 | 18.848 | 18.886 |
| 89.00148754183712 | -0.425 | -0.128 | 19.033 | 19.072 |
| 89.16883599851246 | -0.464 | -0.077 | 19.125 | 19.165 |
| 89.33618445518782 | -0.474 | -0.068 | 19.064 | 19.103 |
| 89.50353291186315 | -0.461 | -0.059 | 18.822 | 18.861 |
| 89.6708813685385 | -0.453 | -0.059 | 18.636 | 18.676 |
| 89.83822982521386 | -0.446 | -0.059 | 18.451 | 18.49 |
| 90.00557828188919 | -0.462 | -0.023 | 18.504 | 18.541 |
| 90.16362960208257 | -0.479 | 0.011 | 18.566 | 18.603 |
| 90.3309780587579 | -0.512 | 0.017 | 18.724 | 18.762 |
| 90.49832651543326 | -0.536 | 0.016 | 18.87 | 18.91 |
| 90.66567497210859 | -0.532 | 0.001 | 19.036 | 19.077 |
| 90.83302342878395 | -0.549 | -0.004 | 19.296 | 19.338 |
| 91.00037188545929 | -0.559 | 0.017 | 19.45 | 19.491 |
| 91.16772034213463 | -0.568 | 0.042 | 19.587 | 19.63 |
| 91.33506879880998 | -0.576 | 0.065 | 19.617 | 19.661 |
| 91.50241725548533 | -0.549 | 0.052 | 19.498 | 19.543 |
| 91.66976571216065 | -0.518 | 0.012 | 19.412 | 19.457 |
| 91.83711416883601 | -0.55 | -0.006 | 19.547 | 19.592 |
| 92.00446262551137 | -0.593 | -0.005 | 19.709 | 19.756 |
| 92.1718110821867 | -0.592 | -0.002 | 19.682 | 19.726 |
| 92.33915953886203 | -0.58 | -0.057 | 19.701 | 19.744 |
| 92.49721085905541 | -0.603 | -0.082 | 19.813 | 19.856 |
| 92.66455931573077 | -0.624 | -0.103 | 19.861 | 19.902 |
| 92.83190777240611 | -0.606 | -0.135 | 19.759 | 19.797 |
| 92.99925622908145 | -0.55 | -0.156 | 19.475 | 19.51 |
| 93.1666046857568 | -0.538 | -0.213 | 19.448 | 19.482 |
| 93.33395314243214 | -0.529 | -0.247 | 19.485 | 19.516 |
| 93.50130159910749 | -0.561 | -0.274 | 19.643 | 19.671 |
| 93.66865005578283 | -0.581 | -0.301 | 19.764 | 19.79 |
| 93.83599851245818 | -0.597 | -0.302 | 19.827 | 19.851 |
| 94.00334696913353 | -0.531 | -0.338 | 19.662 | 19.684 |
| 94.17069542580886 | -0.537 | -0.335 | 19.715 | 19.738 |
| 94.3380438824842 | -0.543 | -0.334 | 19.79 | 19.812 |
| 94.50539233915954 | -0.522 | -0.36 | 20.117 | 20.139 |
| 94.66344365935292 | -0.51 | -0.378 | 20.446 | 20.468 |
| 94.83079211602828 | -0.548 | -0.359 | 20.786 | 20.807 |
| 94.99814057270362 | -0.523 | -0.375 | 20.816 | 20.837 |
| 95.16548902937897 | -0.477 | -0.397 | 20.838 | 20.859 |
| 95.33283748605432 | -0.509 | -0.386 | 21.098 | 21.12 |
| 95.50018594272963 | -0.538 | -0.371 | 21.354 | 21.376 |
| 95.66753439940499 | -0.565 | -0.353 | 21.539 | 21.561 |
| 95.83488285608034 | -0.523 | -0.355 | 21.558 | 21.58 |
| 96.00223131275567 | -0.51 | -0.346 | 21.482 | 21.502 |
| 96.16957976943102 | -0.512 | -0.313 | 21.332 | 21.351 |
| 96.33692822610638 | -0.485 | -0.294 | 21.115 | 21.135 |
| 96.50427668278171 | -0.473 | -0.283 | 20.846 | 20.867 |
| 96.67162513945706 | -0.457 | -0.299 | 20.618 | 20.64 |
| 96.8389735961324 | -0.493 | -0.279 | 20.592 | 20.615 |
| 96.99702491632577 | -0.558 | -0.236 | 20.673 | 20.697 |
| 97.16437337300111 | -0.603 | -0.21 | 20.601 | 20.625 |
| 97.33172182967647 | -0.545 | -0.21 | 20.299 | 20.321 |
| 97.49907028635181 | -0.517 | -0.213 | 20.036 | 20.059 |
| 97.66641874302715 | -0.49 | -0.251 | 19.962 | 19.986 |
| 97.8337671997025 | -0.509 | -0.263 | 20.026 | 20.053 |
| 98.00111565637785 | -0.531 | -0.271 | 20.101 | 20.129 |
| 98.16846411305319 | -0.553 | -0.264 | 20.188 | 20.217 |
| 98.33581256972855 | -0.576 | -0.273 | 20.258 | 20.286 |
| 98.50316102640389 | -0.564 | -0.355 | 20.194 | 20.221 |
| 98.67050948307921 | -0.533 | -0.471 | 20.186 | 20.213 |
| 98.83785793975456 | -0.574 | -0.484 | 20.502 | 20.529 |
| 99.0052063964299 | -0.581 | -0.527 | 20.752 | 20.778 |
| 99.17255485310525 | -0.561 | -0.582 | 20.919 | 20.943 |
| 99.33060617329863 | -0.517 | -0.613 | 20.829 | 20.854 |
| 99.49795462997399 | -0.482 | -0.636 | 20.706 | 20.731 |
| 99.66530308664933 | -0.462 | -0.651 | 20.56 | 20.586 |
| 99.83265154332467 | -0.48 | -0.656 | 20.641 | 20.668 |
| 100.0 | -0.533 | -0.625 | 20.799 | 20.826 |